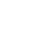
| Category | Series 1 |
|---|---|
|  | 0 |